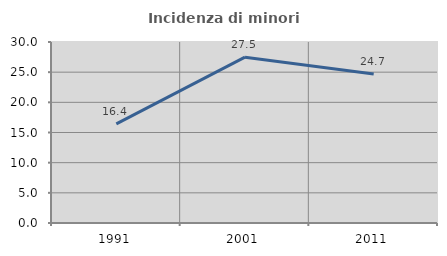
| Category | Incidenza di minori stranieri |
|---|---|
| 1991.0 | 16.429 |
| 2001.0 | 27.49 |
| 2011.0 | 24.714 |